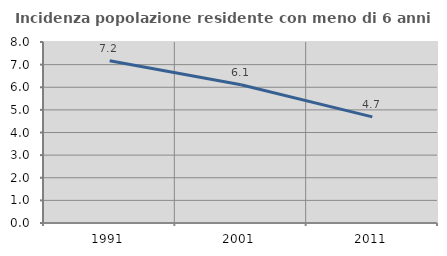
| Category | Incidenza popolazione residente con meno di 6 anni |
|---|---|
| 1991.0 | 7.173 |
| 2001.0 | 6.112 |
| 2011.0 | 4.689 |